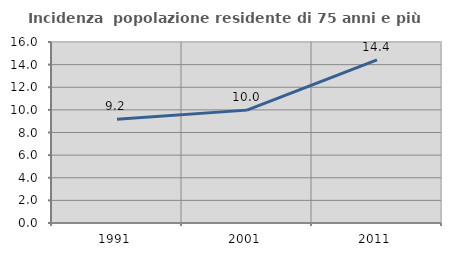
| Category | Incidenza  popolazione residente di 75 anni e più |
|---|---|
| 1991.0 | 9.161 |
| 2001.0 | 9.978 |
| 2011.0 | 14.414 |